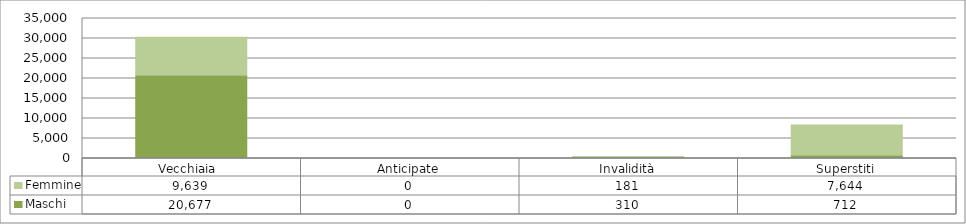
| Category | Maschi | Femmine |
|---|---|---|
| Vecchiaia  | 20677 | 9639 |
| Anticipate | 0 | 0 |
| Invalidità | 310 | 181 |
| Superstiti | 712 | 7644 |